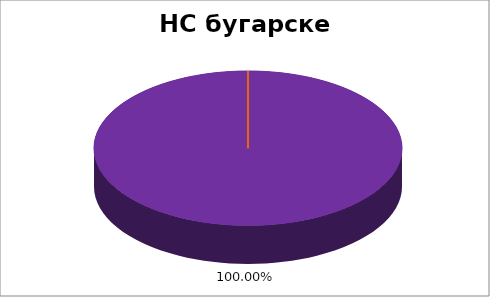
| Category | НС бугарске НМ |
|---|---|
| 0 | 0 |
| 1 | 0 |
| 2 | 0 |
| 3 | 0 |
| 4 | 1 |